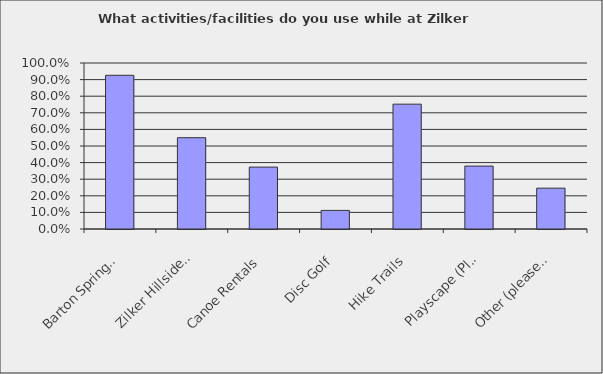
| Category | Series 0 |
|---|---|
| Barton Springs Pool | 0.926 |
| Zilker Hillside Theatre | 0.55 |
| Canoe Rentals | 0.373 |
| Disc Golf | 0.112 |
| Hike Trails | 0.752 |
| Playscape (Playground) | 0.379 |
| Other (please specify) | 0.246 |